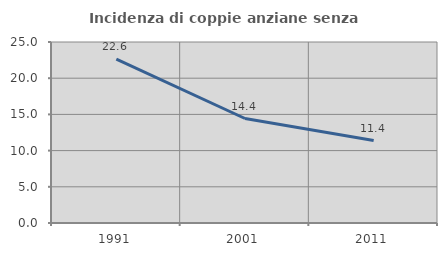
| Category | Incidenza di coppie anziane senza figli  |
|---|---|
| 1991.0 | 22.642 |
| 2001.0 | 14.433 |
| 2011.0 | 11.392 |